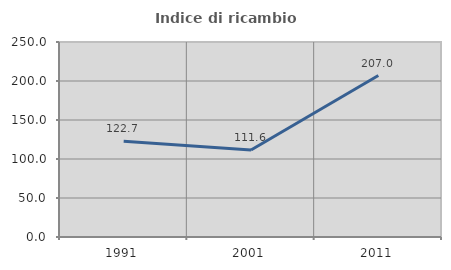
| Category | Indice di ricambio occupazionale  |
|---|---|
| 1991.0 | 122.667 |
| 2001.0 | 111.628 |
| 2011.0 | 207.018 |